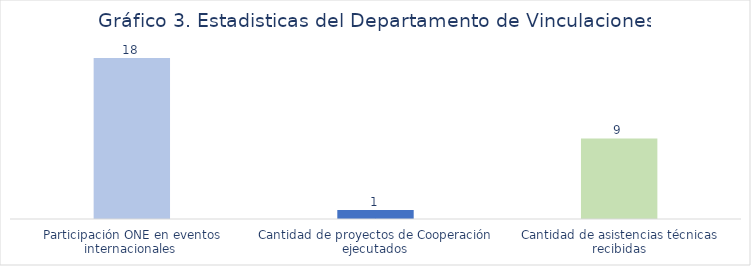
| Category | Series 0 |
|---|---|
| Participación ONE en eventos internacionales  | 18 |
| Cantidad de proyectos de Cooperación ejecutados | 1 |
| Cantidad de asistencias técnicas recibidas | 9 |